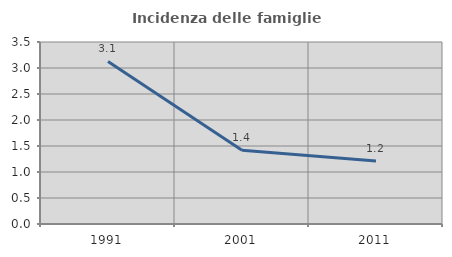
| Category | Incidenza delle famiglie numerose |
|---|---|
| 1991.0 | 3.126 |
| 2001.0 | 1.417 |
| 2011.0 | 1.211 |